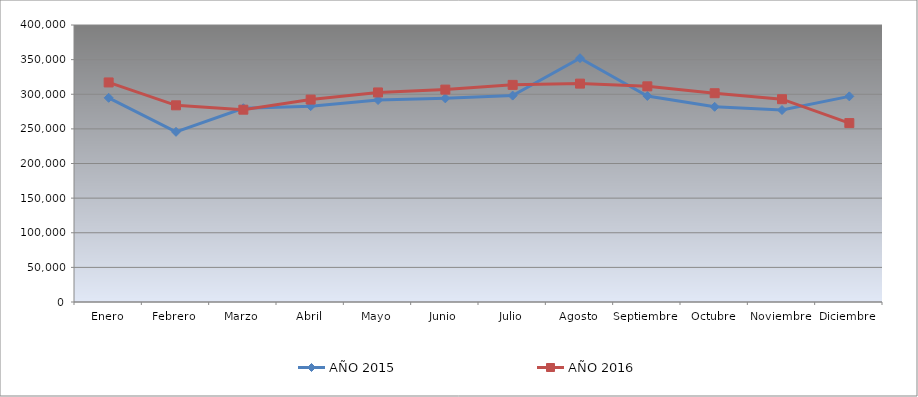
| Category | AÑO 2015 | AÑO 2016 |
|---|---|---|
| Enero | 294835.978 | 317050.519 |
| Febrero | 245729.471 | 284005.512 |
| Marzo | 279829.297 | 277710.285 |
| Abril | 282822.756 | 292303.765 |
| Mayo | 291694.816 | 302614.913 |
| Junio | 294087.613 | 306709.77 |
| Julio | 298065.762 | 313557.557 |
| Agosto | 352036.639 | 315363.241 |
| Septiembre | 297524.182 | 311426.257 |
| Octubre | 281877.453 | 301499.928 |
| Noviembre | 277219.868 | 292866.192 |
| Diciembre | 296972.756 | 258360.849 |